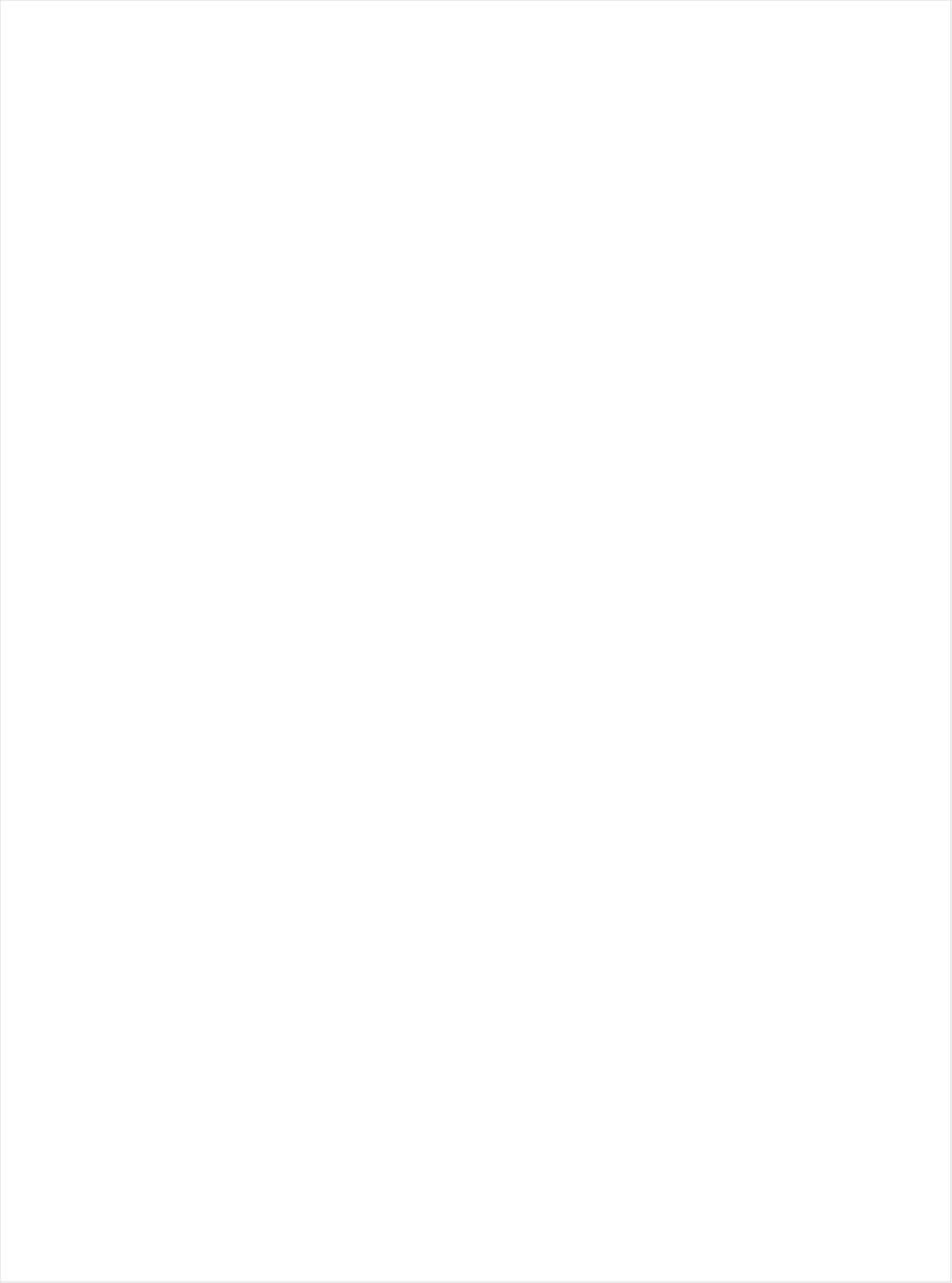
| Category | Total |
|---|---|
| Telemundo | -0.69 |
| UniMas | -0.667 |
| Galavision | -0.644 |
| Univision | -0.629 |
| NBC Universo | -0.586 |
| TUDN | -0.431 |
| Hallmark Movies & Mysteries | -0.256 |
| Logo | -0.246 |
| Hallmark | -0.237 |
| Cartoon Network | -0.219 |
| UP TV | -0.205 |
| Discovery Life Channel | -0.163 |
| TLC | -0.15 |
| Lifetime Movies | -0.143 |
| Disney XD | -0.123 |
| Teen Nick | -0.122 |
| Disney Channel | -0.118 |
| WE TV | -0.114 |
| Nick Toons | -0.108 |
| Travel | -0.106 |
| Adult Swim | -0.104 |
| Oprah Winfrey Network | -0.101 |
| INSP | -0.099 |
| Lifetime | -0.086 |
| Nick | -0.083 |
| RFD TV | -0.072 |
| OXYGEN | -0.07 |
| Investigation Discovery | -0.064 |
| Nick@Nite | -0.047 |
| VH1 | -0.031 |
| ION | -0.03 |
| BET | -0.028 |
| Nick Jr. | -0.02 |
| Universal Kids | -0.02 |
| CMTV | -0.01 |
| POP | -0.004 |
| PBS | -0.002 |
| E! | -0.002 |
| Great American Country | -0.001 |
| Disney Junior US | 0.004 |
| BRAVO | 0.009 |
| TV LAND | 0.014 |
| Weather Channel | 0.019 |
| CW | 0.024 |
| Discovery Family Channel | 0.027 |
| HGTV | 0.029 |
| Science Channel | 0.03 |
| TV ONE | 0.037 |
| Freeform | 0.04 |
| Headline News | 0.052 |
| SYFY | 0.055 |
| Animal Planet | 0.059 |
| FXX | 0.067 |
| USA Network | 0.075 |
| Fox Business | 0.077 |
| National Geographic Wild | 0.092 |
| A&E | 0.092 |
| WGN America | 0.101 |
| MSNBC | 0.104 |
| Ovation | 0.112 |
| BET Her | 0.116 |
| MTV | 0.118 |
| FX | 0.121 |
| Discovery Channel | 0.128 |
| Motor Trend Network | 0.131 |
| CBS | 0.137 |
| TBS | 0.14 |
| Food Network | 0.141 |
| ABC | 0.141 |
| Fox News | 0.143 |
| Smithsonian | 0.146 |
| Bloomberg HD | 0.146 |
| FYI | 0.148 |
| Reelz Channel | 0.148 |
| BBC America | 0.15 |
| MTV2 | 0.15 |
| Game Show | 0.15 |
| NBC | 0.152 |
| FX Movie Channel | 0.154 |
| DIY | 0.154 |
| History Channel | 0.163 |
| SundanceTV | 0.174 |
| TNT | 0.178 |
| Destination America | 0.185 |
| American Heroes Channel | 0.191 |
| National Geographic | 0.194 |
| Paramount Network | 0.196 |
| FOX | 0.206 |
| CNN | 0.206 |
| AMC | 0.21 |
| CNBC | 0.21 |
| Cooking Channel | 0.216 |
| Comedy Central | 0.245 |
| Olympic Channel | 0.252 |
| truTV | 0.254 |
| Viceland | 0.257 |
| Outdoor Channel | 0.264 |
| Tennis Channel | 0.289 |
| Independent Film (IFC) | 0.29 |
| The Sportsman Channel | 0.345 |
| FXDEP | 0.442 |
| NBC Sports | 0.447 |
| ESPN Deportes | 0.456 |
| MyNetworkTV | 0.521 |
| Fox Sports 1 | 0.527 |
| FOX Sports 2 | 0.568 |
| CBS Sports | 0.621 |
| NHL | 0.628 |
| Golf | 0.651 |
| MLB Network | 0.663 |
| PAC-12 Network | 0.677 |
| Big Ten Network | 0.683 |
| ESPNU | 0.711 |
| ESPNEWS | 0.74 |
| NBA TV | 0.742 |
| ESPN | 0.776 |
| ESPN2 | 0.787 |
| NFL Network | 1.019 |